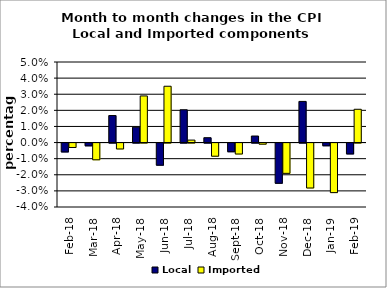
| Category | Local | Imported |
|---|---|---|
| 2018-02-01 | -0.006 | -0.003 |
| 2018-03-01 | -0.002 | -0.01 |
| 2018-04-01 | 0.017 | -0.004 |
| 2018-05-01 | 0.01 | 0.029 |
| 2018-06-01 | -0.014 | 0.035 |
| 2018-07-01 | 0.02 | 0.002 |
| 2018-08-01 | 0.003 | -0.008 |
| 2018-09-01 | -0.005 | -0.007 |
| 2018-10-01 | 0.004 | -0.001 |
| 2018-11-01 | -0.025 | -0.019 |
| 2018-12-01 | 0.026 | -0.028 |
| 2019-01-01 | -0.002 | -0.031 |
| 2019-02-01 | -0.007 | 0.021 |